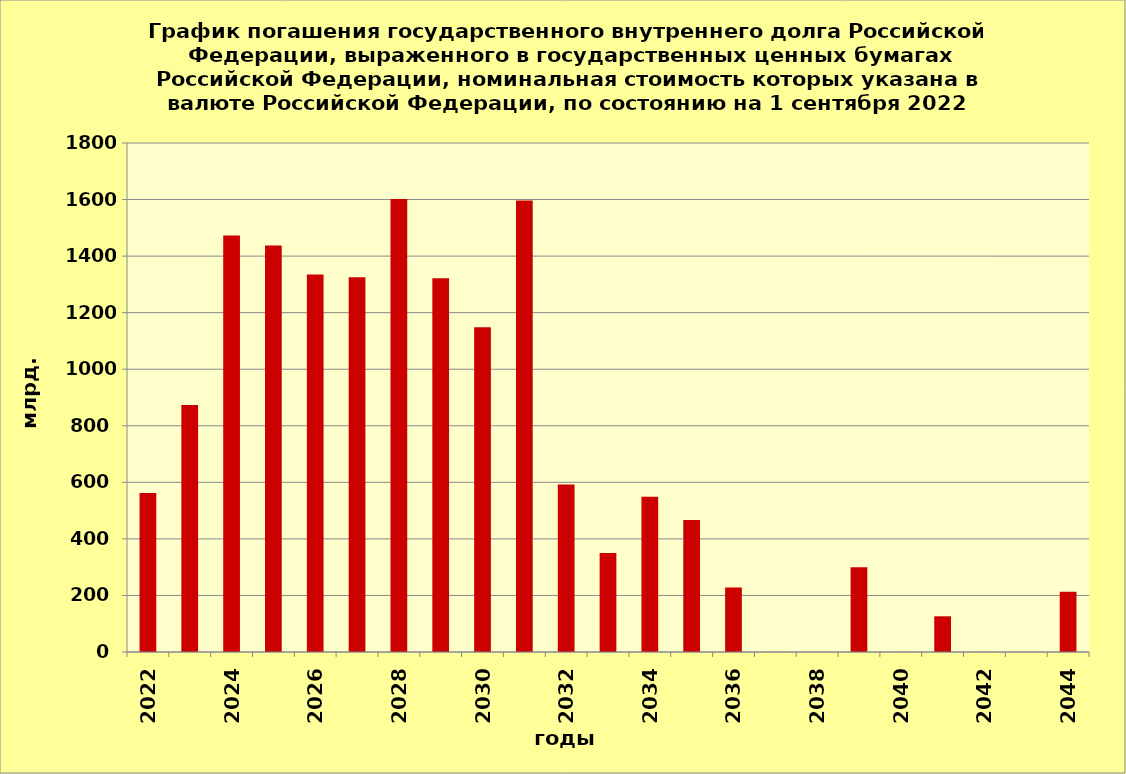
| Category | ряд 1 |
|---|---|
| 2022 | 562.415 |
| 2023 | 873.636 |
| 2024 | 1473.1 |
| 2025 | 1437.746 |
| 2026 | 1334.561 |
| 2027 | 1324.833 |
| 2028 | 1601.756 |
| 2029 | 1321.585 |
| 2030 | 1148.809 |
| 2031 | 1596.903 |
| 2032 | 592.201 |
| 2033 | 350 |
| 2034 | 548.84 |
| 2035 | 467.105 |
| 2036 | 227.812 |
| 2037 | 0 |
| 2038 | 0 |
| 2039 | 300 |
| 2040 | 0 |
| 2041 | 126.269 |
| 2042 | 0 |
| 2043 | 0 |
| 2044 | 212.636 |